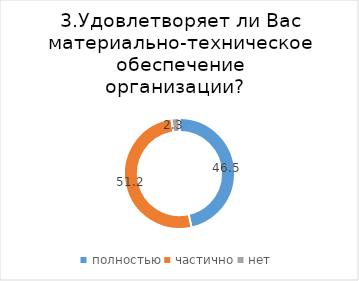
| Category | Series 0 |
|---|---|
| полностью | 46.512 |
| частично | 51.163 |
| нет | 2.326 |